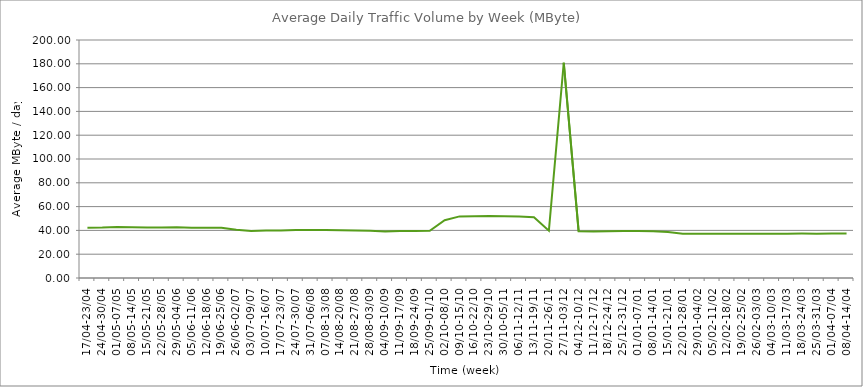
| Category | Average |
|---|---|
| 17/04-23/04 | 42.24 |
| 24/04-30/04 | 42.42 |
| 01/05-07/05 | 42.95 |
| 08/05-14/05 | 42.72 |
| 15/05-21/05 | 42.4 |
| 22/05-28/05 | 42.51 |
| 29/05-04/06 | 42.57 |
| 05/06-11/06 | 42.19 |
| 12/06-18/06 | 42.3 |
| 19/06-25/06 | 42.3 |
| 26/06-02/07 | 40.48 |
| 03/07-09/07 | 39.59 |
| 10/07-16/07 | 39.87 |
| 17/07-23/07 | 39.96 |
| 24/07-30/07 | 40.44 |
| 31/07-06/08 | 40.25 |
| 07/08-13/08 | 40.34 |
| 14/08-20/08 | 40.14 |
| 21/08-27/08 | 39.9 |
| 28/08-03/09 | 39.78 |
| 04/09-10/09 | 39.13 |
| 11/09-17/09 | 39.48 |
| 18/09-24/09 | 39.51 |
| 25/09-01/10 | 39.73 |
| 02/10-08/10 | 48.56 |
| 09/10-15/10 | 51.77 |
| 16/10-22/10 | 51.8 |
| 23/10-29/10 | 52.02 |
| 30/10-05/11 | 51.89 |
| 06/11-12/11 | 51.66 |
| 13/11-19/11 | 51.02 |
| 20/11-26/11 | 39.7 |
| 27/11-03/12 | 180.88 |
| 04/12-10/12 | 39.25 |
| 11/12-17/12 | 39.18 |
| 18/12-24/12 | 39.25 |
| 25/12-31/12 | 39.45 |
| 01/01-07/01 | 39.56 |
| 08/01-14/01 | 39.21 |
| 15/01-21/01 | 38.57 |
| 22/01-28/01 | 37.17 |
| 29/01-04/02 | 37.25 |
| 05/02-11/02 | 37.24 |
| 12/02-18/02 | 37.24 |
| 19/02-25/02 | 37.22 |
| 26/02-03/03 | 37.28 |
| 04/03-10/03 | 37.26 |
| 11/03-17/03 | 37.23 |
| 18/03-24/03 | 37.29 |
| 25/03-31/03 | 37.25 |
| 01/04-07/04 | 37.32 |
| 08/04-14/04 | 37.29 |